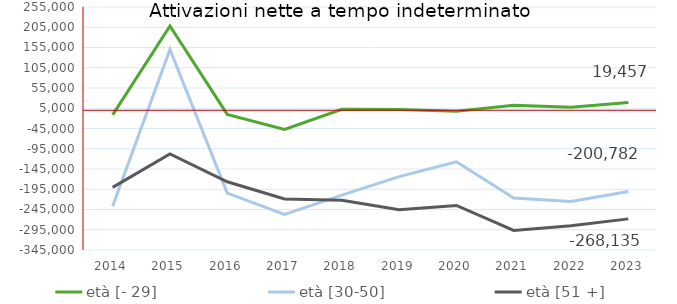
| Category | età [- 29] | età [30-50] | età [51 +] |
|---|---|---|---|
| 2014.0 | -11361 | -237102 | -190331 |
| 2015.0 | 208266 | 149929 | -107975 |
| 2016.0 | -10215 | -204648 | -176551 |
| 2017.0 | -47166 | -257072 | -218960 |
| 2018.0 | 2307 | -209545 | -222149 |
| 2019.0 | 1641 | -163847 | -245618 |
| 2020.0 | -2624 | -127098 | -235024 |
| 2021.0 | 12240 | -216771 | -296833 |
| 2022.0 | 7622 | -225201 | -284979 |
| 2023.0 | 19457 | -200782 | -268135 |